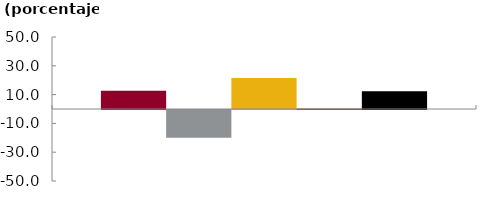
| Category | Bancos | CF | CFC | Coop | Sistema |
|---|---|---|---|---|---|
|  | 12.638 | -19.286 | 21.553 | 0.412 | 12.309 |